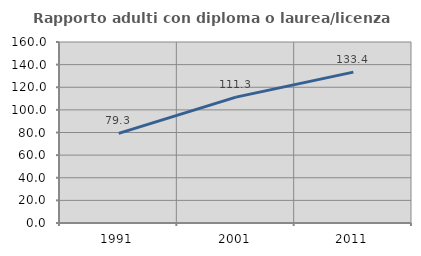
| Category | Rapporto adulti con diploma o laurea/licenza media  |
|---|---|
| 1991.0 | 79.277 |
| 2001.0 | 111.271 |
| 2011.0 | 133.372 |